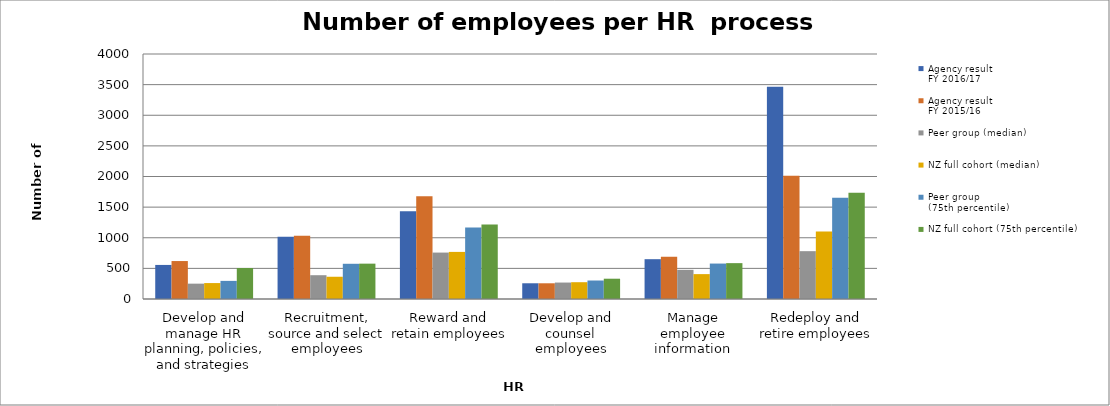
| Category | Agency result
FY 2016/17 | Agency result
FY 2015/16 | Peer group (median) | NZ full cohort (median) | Peer group 
(75th percentile) | NZ full cohort (75th percentile) |
|---|---|---|---|---|---|---|
| Develop and manage HR planning, policies, and strategies | 556.15 | 619.692 | 250.599 | 260.122 | 295.738 | 506.555 |
| Recruitment, source and select employees | 1014.634 | 1032.82 | 388.609 | 363.217 | 575.028 | 577.226 |
| Reward and retain employees | 1434.483 | 1678.333 | 757.988 | 768.904 | 1165.544 | 1214.7 |
| Develop and counsel employees | 256.79 | 256.56 | 268.52 | 274.216 | 301.915 | 331.299 |
| Manage employee information | 650 | 689.726 | 476.149 | 406.194 | 578.645 | 585.472 |
| Redeploy and retire employees | 3466.667 | 2014 | 781.014 | 1102.038 | 1653.385 | 1734.407 |